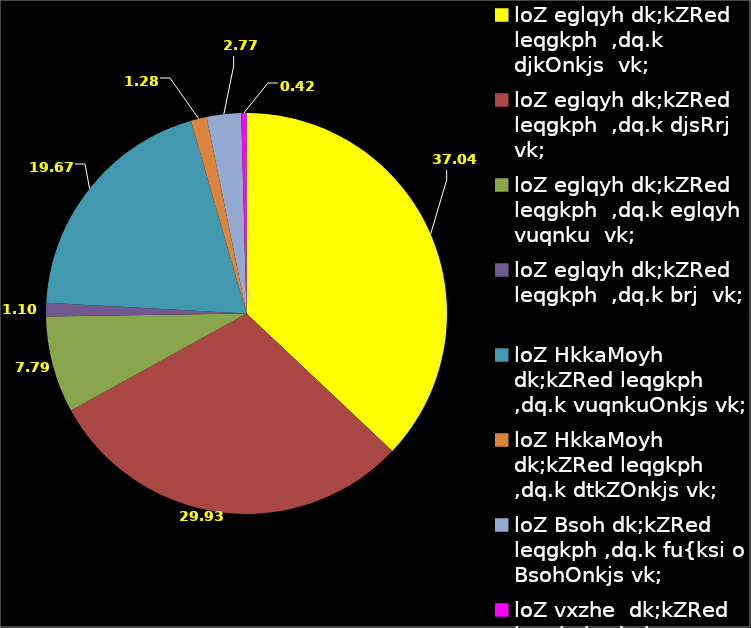
| Category | Series 0 |
|---|---|
| loZ eglqyh dk;kZRed leqgkph  ,dq.k djkOnkjs  vk; | 37.04 |
| loZ eglqyh dk;kZRed leqgkph  ,dq.k djsRrj vk; | 29.93 |
| loZ eglqyh dk;kZRed leqgkph  ,dq.k eglqyh vuqnku  vk; | 7.79 |
| loZ eglqyh dk;kZRed leqgkph  ,dq.k brj  vk; | 1.1 |
| loZ HkkaMoyh dk;kZRed leqgkph ,dq.k vuqnkuOnkjs vk; | 19.67 |
| loZ HkkaMoyh dk;kZRed leqgkph ,dq.k dtkZOnkjs vk; | 1.28 |
| loZ Bsoh dk;kZRed leqgkph ,dq.k fu{ksi o BsohOnkjs vk; | 2.77 |
| loZ vxzhe  dk;kZRed leqgkph ,dq.k vxzheOnkjs vk; | 0.42 |